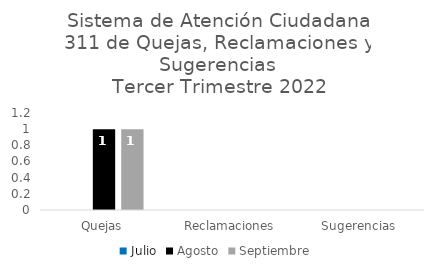
| Category | Julio | Agosto | Septiembre |
|---|---|---|---|
| Quejas | 0 | 1 | 1 |
| Reclamaciones | 0 | 0 | 0 |
| Sugerencias | 0 | 0 | 0 |